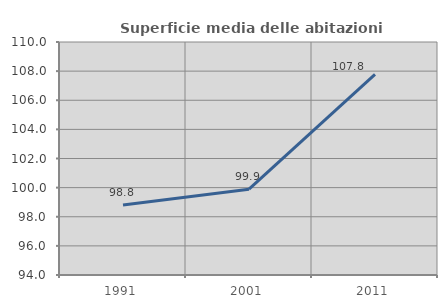
| Category | Superficie media delle abitazioni occupate |
|---|---|
| 1991.0 | 98.803 |
| 2001.0 | 99.895 |
| 2011.0 | 107.776 |